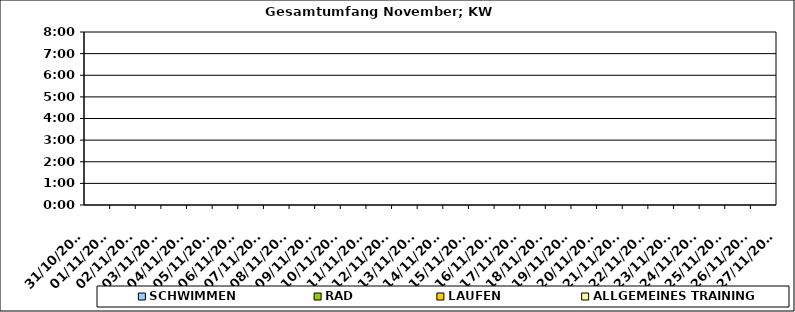
| Category | SCHWIMMEN | RAD | LAUFEN | ALLGEMEINES TRAINING |
|---|---|---|---|---|
| 31/10/2022 |  |  |  | 0 |
| 01/11/2022 |  |  |  | 0 |
| 02/11/2022 |  |  |  | 0 |
| 03/11/2022 |  |  |  | 0 |
| 04/11/2022 |  |  |  | 0 |
| 05/11/2022 |  |  |  | 0 |
| 06/11/2022 |  |  |  | 0 |
| 07/11/2022 |  |  |  | 0 |
| 08/11/2022 |  |  |  | 0 |
| 09/11/2022 |  |  |  | 0 |
| 10/11/2022 |  |  |  | 0 |
| 11/11/2022 |  |  |  | 0 |
| 12/11/2022 |  |  |  | 0 |
| 13/11/2022 |  |  |  | 0 |
| 14/11/2022 |  |  |  | 0 |
| 15/11/2022 |  |  |  | 0 |
| 16/11/2022 |  |  |  | 0 |
| 17/11/2022 |  |  |  | 0 |
| 18/11/2022 |  |  |  | 0 |
| 19/11/2022 |  |  |  | 0 |
| 20/11/2022 |  |  |  | 0 |
| 21/11/2022 |  |  |  | 0 |
| 22/11/2022 |  |  |  | 0 |
| 23/11/2022 |  |  |  | 0 |
| 24/11/2022 |  |  |  | 0 |
| 25/11/2022 |  |  |  | 0 |
| 26/11/2022 |  |  |  | 0 |
| 27/11/2022 |  |  |  | 0 |